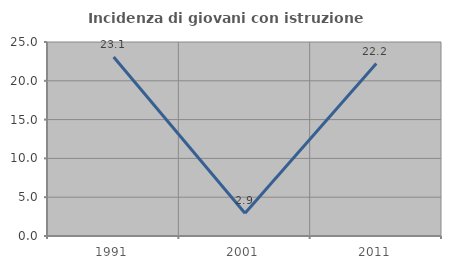
| Category | Incidenza di giovani con istruzione universitaria |
|---|---|
| 1991.0 | 23.077 |
| 2001.0 | 2.941 |
| 2011.0 | 22.222 |